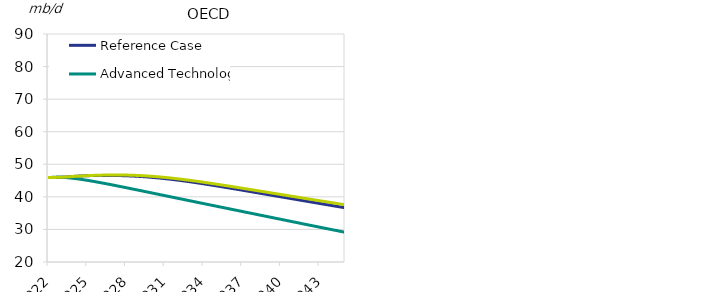
| Category | Reference Case | Advanced Technology | Laissez-Faire |
|---|---|---|---|
| 2022.0 | 45.947 | 45.947 | 45.947 |
| 2023.0 | 46.02 | 46.02 | 46.02 |
| 2024.0 | 46.278 | 45.678 | 46.278 |
| 2025.0 | 46.49 | 45.099 | 46.501 |
| 2026.0 | 46.585 | 44.409 | 46.655 |
| 2027.0 | 46.578 | 43.658 | 46.721 |
| 2028.0 | 46.482 | 42.855 | 46.697 |
| 2029.0 | 46.3 | 42.051 | 46.561 |
| 2030.0 | 46.011 | 41.236 | 46.319 |
| 2031.0 | 45.63 | 40.415 | 45.984 |
| 2032.0 | 45.169 | 39.599 | 45.566 |
| 2033.0 | 44.634 | 38.787 | 45.074 |
| 2034.0 | 44.04 | 37.976 | 44.519 |
| 2035.0 | 43.403 | 37.165 | 43.921 |
| 2036.0 | 42.751 | 36.356 | 43.307 |
| 2037.0 | 42.083 | 35.547 | 42.678 |
| 2038.0 | 41.404 | 34.739 | 42.038 |
| 2039.0 | 40.719 | 33.933 | 41.391 |
| 2040.0 | 40.036 | 33.127 | 40.747 |
| 2041.0 | 39.356 | 32.323 | 40.106 |
| 2042.0 | 38.678 | 31.512 | 39.466 |
| 2043.0 | 38.002 | 30.712 | 38.829 |
| 2044.0 | 37.329 | 29.921 | 38.195 |
| 2045.0 | 36.659 | 29.14 | 37.564 |